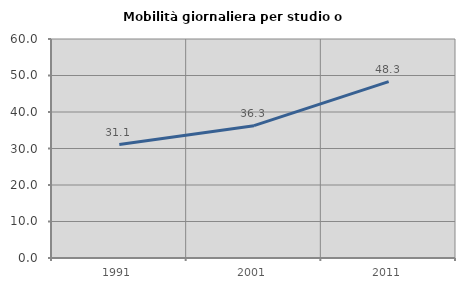
| Category | Mobilità giornaliera per studio o lavoro |
|---|---|
| 1991.0 | 31.075 |
| 2001.0 | 36.263 |
| 2011.0 | 48.323 |